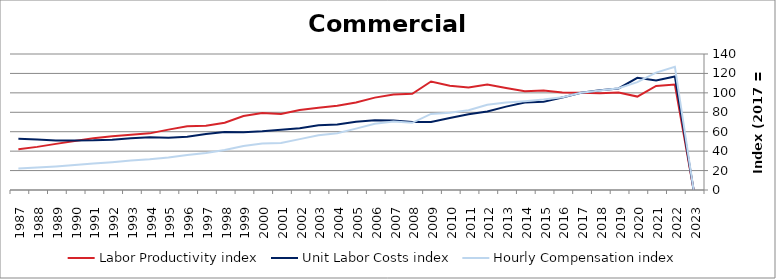
| Category | Labor Productivity index | Unit Labor Costs index | Hourly Compensation index |
|---|---|---|---|
| 2023.0 | 0 | 0 | 0 |
| 2022.0 | 108.547 | 116.928 | 126.922 |
| 2021.0 | 107.112 | 112.798 | 120.82 |
| 2020.0 | 96.158 | 115.533 | 111.095 |
| 2019.0 | 100.26 | 104.512 | 104.783 |
| 2018.0 | 99.666 | 102.673 | 102.329 |
| 2017.0 | 100 | 100 | 100 |
| 2016.0 | 100.257 | 95.314 | 95.559 |
| 2015.0 | 102.509 | 90.885 | 93.165 |
| 2014.0 | 101.669 | 89.953 | 91.455 |
| 2013.0 | 105.012 | 85.85 | 90.152 |
| 2012.0 | 108.529 | 80.861 | 87.757 |
| 2011.0 | 105.454 | 77.91 | 82.159 |
| 2010.0 | 107.326 | 74.18 | 79.614 |
| 2009.0 | 111.666 | 70.097 | 78.274 |
| 2008.0 | 98.954 | 69.886 | 69.155 |
| 2007.0 | 98.386 | 71.57 | 70.416 |
| 2006.0 | 95.082 | 71.715 | 68.188 |
| 2005.0 | 89.986 | 70.187 | 63.158 |
| 2004.0 | 86.683 | 67.332 | 58.366 |
| 2003.0 | 84.751 | 66.585 | 56.432 |
| 2002.0 | 82.342 | 63.592 | 52.363 |
| 2001.0 | 78.327 | 61.922 | 48.502 |
| 2000.0 | 79.302 | 60.484 | 47.965 |
| 1999.0 | 76.09 | 59.485 | 45.262 |
| 1998.0 | 69.174 | 59.679 | 41.282 |
| 1997.0 | 66.124 | 57.697 | 38.152 |
| 1996.0 | 65.664 | 54.869 | 36.029 |
| 1995.0 | 62.148 | 53.741 | 33.399 |
| 1994.0 | 58.31 | 54.211 | 31.61 |
| 1993.0 | 56.908 | 53.32 | 30.343 |
| 1992.0 | 55.301 | 51.821 | 28.658 |
| 1991.0 | 53.276 | 51.089 | 27.218 |
| 1990.0 | 50.462 | 50.872 | 25.671 |
| 1989.0 | 47.488 | 51.035 | 24.235 |
| 1988.0 | 44.39 | 51.895 | 23.036 |
| 1987.0 | 41.867 | 52.789 | 22.101 |